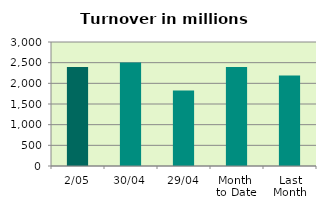
| Category | Series 0 |
|---|---|
| 2/05 | 2396.797 |
| 30/04 | 2505.365 |
| 29/04 | 1827.663 |
| Month 
to Date | 2396.797 |
| Last
Month | 2186.926 |